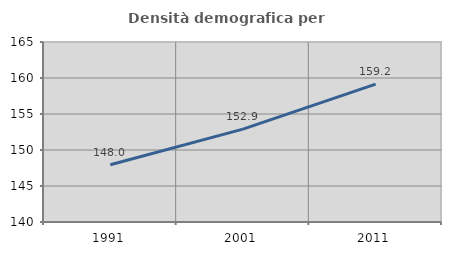
| Category | Densità demografica |
|---|---|
| 1991.0 | 147.952 |
| 2001.0 | 152.897 |
| 2011.0 | 159.157 |